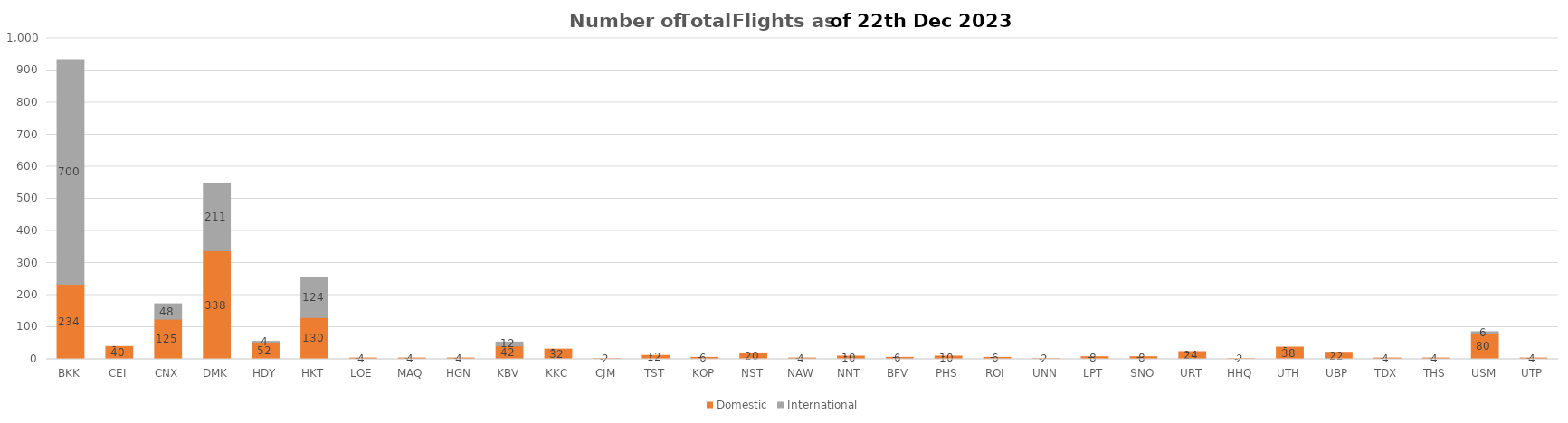
| Category | Domestic | International |
|---|---|---|
| BKK | 234 | 700 |
| CEI | 40 | 0 |
| CNX | 125 | 48 |
| DMK | 338 | 211 |
| HDY | 52 | 4 |
| HKT | 130 | 124 |
| LOE | 4 | 0 |
| MAQ | 4 | 0 |
| HGN | 4 | 0 |
| KBV | 42 | 12 |
| KKC | 32 | 0 |
| CJM | 2 | 0 |
| TST | 12 | 0 |
| KOP | 6 | 0 |
| NST | 20 | 0 |
| NAW | 4 | 0 |
| NNT | 10 | 0 |
| BFV | 6 | 0 |
| PHS | 10 | 0 |
| ROI | 6 | 0 |
| UNN | 2 | 0 |
| LPT | 8 | 0 |
| SNO | 8 | 0 |
| URT | 24 | 0 |
| HHQ | 2 | 0 |
| UTH | 38 | 0 |
| UBP | 22 | 0 |
| TDX | 4 | 0 |
| THS | 4 | 0 |
| USM | 80 | 6 |
| UTP | 4 | 0 |